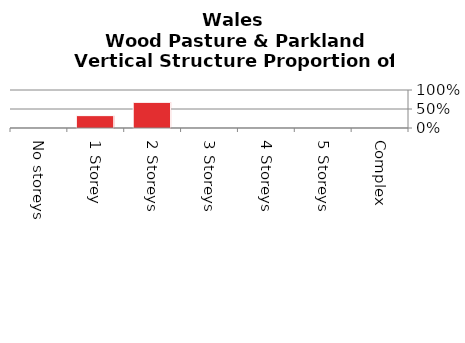
| Category | Wood Pasture & Parkland |
|---|---|
| No storeys | 0 |
| 1 Storey | 0.326 |
| 2 Storeys | 0.674 |
| 3 Storeys | 0 |
| 4 Storeys | 0 |
| 5 Storeys | 0 |
| Complex | 0 |